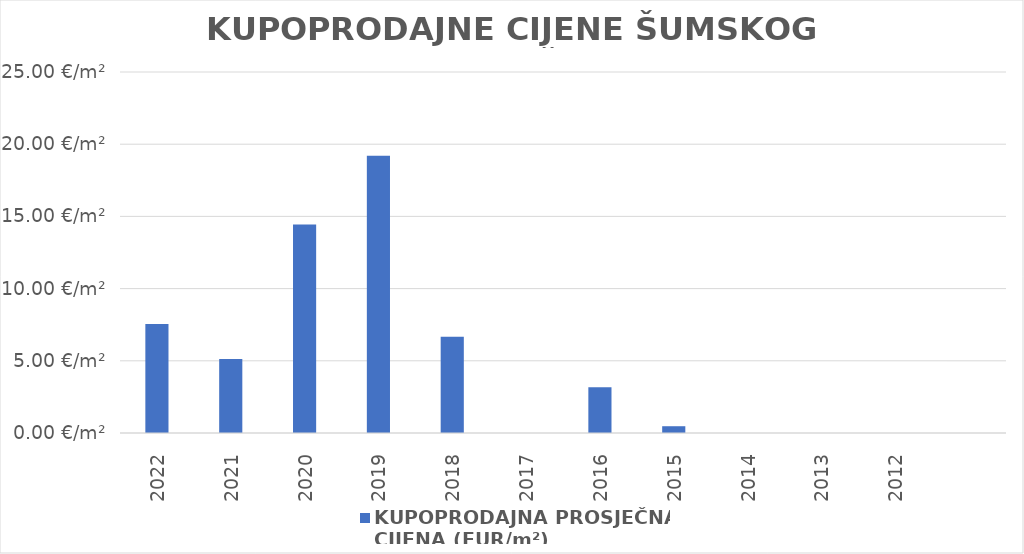
| Category | KUPOPRODAJNA PROSJEČNA 
CIJENA (EUR/m²) |
|---|---|
| 2022 | 1900-01-07 13:18:15 |
| 2021 | 1900-01-05 03:04:59 |
| 2020 | 1900-01-14 10:20:59 |
| 2019 | 1900-01-19 04:44:10 |
| 2018 | 1900-01-06 16:04:32 |
| 2017 | 0 |
| 2016 | 1900-01-03 04:13:43 |
| 2015 | 0.469 |
| 2014 | 0 |
| 2013 | 0 |
| 2012 | 0 |